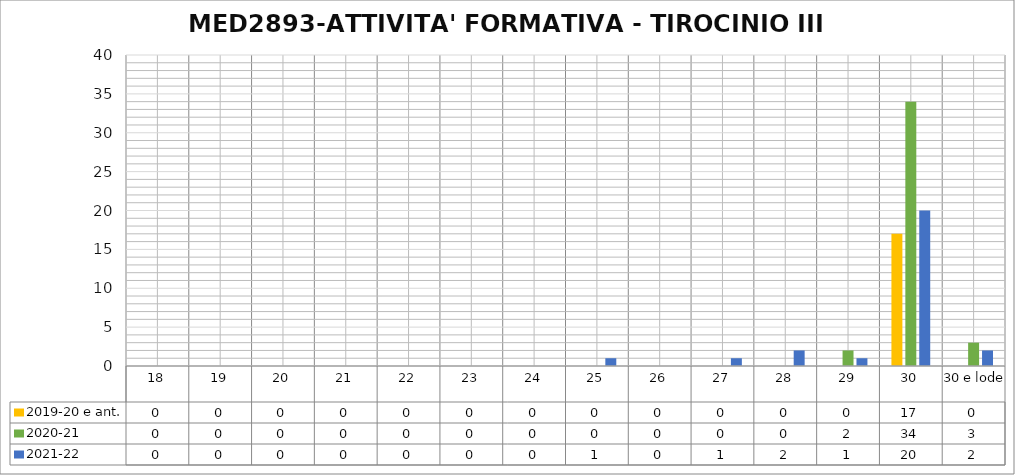
| Category | 2019-20 e ant. | 2020-21 | 2021-22 |
|---|---|---|---|
| 18 | 0 | 0 | 0 |
| 19 | 0 | 0 | 0 |
| 20 | 0 | 0 | 0 |
| 21 | 0 | 0 | 0 |
| 22 | 0 | 0 | 0 |
| 23 | 0 | 0 | 0 |
| 24 | 0 | 0 | 0 |
| 25 | 0 | 0 | 1 |
| 26 | 0 | 0 | 0 |
| 27 | 0 | 0 | 1 |
| 28 | 0 | 0 | 2 |
| 29 | 0 | 2 | 1 |
| 30 | 17 | 34 | 20 |
| 30 e lode | 0 | 3 | 2 |